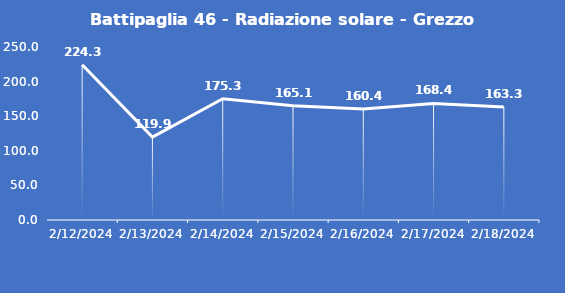
| Category | Battipaglia 46 - Radiazione solare - Grezzo (W/m2) |
|---|---|
| 2/12/24 | 224.3 |
| 2/13/24 | 119.9 |
| 2/14/24 | 175.3 |
| 2/15/24 | 165.1 |
| 2/16/24 | 160.4 |
| 2/17/24 | 168.4 |
| 2/18/24 | 163.3 |